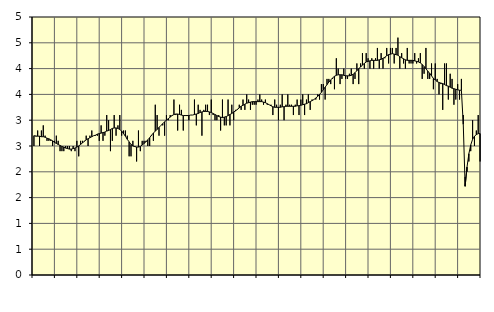
| Category | Piggar | Series 1 |
|---|---|---|
| nan | 2.5 | 2.7 |
| 1.0 | 2.7 | 2.69 |
| 1.0 | 2.8 | 2.69 |
| 1.0 | 2.5 | 2.69 |
| 1.0 | 2.8 | 2.68 |
| 1.0 | 2.9 | 2.68 |
| 1.0 | 2.7 | 2.67 |
| 1.0 | 2.6 | 2.65 |
| 1.0 | 2.6 | 2.64 |
| 1.0 | 2.6 | 2.62 |
| 1.0 | 2.5 | 2.6 |
| 1.0 | 2.6 | 2.57 |
| nan | 2.7 | 2.55 |
| 2.0 | 2.6 | 2.53 |
| 2.0 | 2.4 | 2.51 |
| 2.0 | 2.4 | 2.49 |
| 2.0 | 2.4 | 2.48 |
| 2.0 | 2.5 | 2.46 |
| 2.0 | 2.5 | 2.45 |
| 2.0 | 2.5 | 2.44 |
| 2.0 | 2.4 | 2.44 |
| 2.0 | 2.5 | 2.45 |
| 2.0 | 2.4 | 2.46 |
| 2.0 | 2.6 | 2.48 |
| nan | 2.3 | 2.5 |
| 3.0 | 2.6 | 2.53 |
| 3.0 | 2.6 | 2.56 |
| 3.0 | 2.6 | 2.59 |
| 3.0 | 2.7 | 2.62 |
| 3.0 | 2.5 | 2.64 |
| 3.0 | 2.7 | 2.66 |
| 3.0 | 2.8 | 2.68 |
| 3.0 | 2.7 | 2.7 |
| 3.0 | 2.7 | 2.71 |
| 3.0 | 2.7 | 2.73 |
| 3.0 | 2.6 | 2.74 |
| nan | 2.9 | 2.75 |
| 4.0 | 2.6 | 2.76 |
| 4.0 | 2.7 | 2.77 |
| 4.0 | 3.1 | 2.79 |
| 4.0 | 3 | 2.8 |
| 4.0 | 2.4 | 2.82 |
| 4.0 | 2.6 | 2.84 |
| 4.0 | 3.1 | 2.85 |
| 4.0 | 2.7 | 2.85 |
| 4.0 | 2.9 | 2.84 |
| 4.0 | 3.1 | 2.82 |
| 4.0 | 2.7 | 2.79 |
| nan | 2.8 | 2.74 |
| 5.0 | 2.8 | 2.69 |
| 5.0 | 2.7 | 2.63 |
| 5.0 | 2.3 | 2.58 |
| 5.0 | 2.3 | 2.53 |
| 5.0 | 2.6 | 2.5 |
| 5.0 | 2.5 | 2.49 |
| 5.0 | 2.2 | 2.48 |
| 5.0 | 2.8 | 2.48 |
| 5.0 | 2.4 | 2.49 |
| 5.0 | 2.6 | 2.52 |
| 5.0 | 2.6 | 2.55 |
| nan | 2.6 | 2.58 |
| 6.0 | 2.5 | 2.62 |
| 6.0 | 2.5 | 2.66 |
| 6.0 | 2.7 | 2.71 |
| 6.0 | 2.6 | 2.75 |
| 6.0 | 3.3 | 2.79 |
| 6.0 | 3.1 | 2.82 |
| 6.0 | 2.7 | 2.86 |
| 6.0 | 2.9 | 2.9 |
| 6.0 | 2.9 | 2.93 |
| 6.0 | 2.7 | 2.97 |
| 6.0 | 3.1 | 3 |
| nan | 3 | 3.03 |
| 7.0 | 3.1 | 3.06 |
| 7.0 | 3.1 | 3.09 |
| 7.0 | 3.4 | 3.11 |
| 7.0 | 3.1 | 3.12 |
| 7.0 | 2.8 | 3.12 |
| 7.0 | 3.3 | 3.11 |
| 7.0 | 3.2 | 3.1 |
| 7.0 | 2.8 | 3.09 |
| 7.0 | 3.1 | 3.09 |
| 7.0 | 3.1 | 3.09 |
| 7.0 | 3 | 3.09 |
| nan | 3.1 | 3.1 |
| 8.0 | 3.1 | 3.1 |
| 8.0 | 3.4 | 3.11 |
| 8.0 | 2.9 | 3.12 |
| 8.0 | 3.3 | 3.13 |
| 8.0 | 3.2 | 3.15 |
| 8.0 | 2.7 | 3.16 |
| 8.0 | 3.2 | 3.17 |
| 8.0 | 3.3 | 3.17 |
| 8.0 | 3.3 | 3.17 |
| 8.0 | 3.1 | 3.16 |
| 8.0 | 3.4 | 3.15 |
| nan | 3.1 | 3.13 |
| 9.0 | 3 | 3.11 |
| 9.0 | 3 | 3.09 |
| 9.0 | 3.1 | 3.07 |
| 9.0 | 2.8 | 3.06 |
| 9.0 | 3.4 | 3.05 |
| 9.0 | 2.9 | 3.06 |
| 9.0 | 2.9 | 3.07 |
| 9.0 | 3.4 | 3.09 |
| 9.0 | 2.9 | 3.11 |
| 9.0 | 3.3 | 3.13 |
| 9.0 | 3 | 3.16 |
| nan | 3.2 | 3.18 |
| 10.0 | 3.2 | 3.21 |
| 10.0 | 3.3 | 3.24 |
| 10.0 | 3.2 | 3.27 |
| 10.0 | 3.4 | 3.29 |
| 10.0 | 3.2 | 3.31 |
| 10.0 | 3.5 | 3.33 |
| 10.0 | 3.4 | 3.34 |
| 10.0 | 3.2 | 3.35 |
| 10.0 | 3.3 | 3.36 |
| 10.0 | 3.3 | 3.36 |
| 10.0 | 3.3 | 3.36 |
| nan | 3.4 | 3.36 |
| 11.0 | 3.5 | 3.36 |
| 11.0 | 3.4 | 3.36 |
| 11.0 | 3.3 | 3.35 |
| 11.0 | 3.4 | 3.34 |
| 11.0 | 3.3 | 3.32 |
| 11.0 | 3.3 | 3.3 |
| 11.0 | 3.3 | 3.28 |
| 11.0 | 3.1 | 3.26 |
| 11.0 | 3.4 | 3.25 |
| 11.0 | 3.3 | 3.25 |
| 11.0 | 3 | 3.25 |
| nan | 3.3 | 3.25 |
| 12.0 | 3.5 | 3.26 |
| 12.0 | 3 | 3.26 |
| 12.0 | 3.3 | 3.27 |
| 12.0 | 3.5 | 3.27 |
| 12.0 | 3.3 | 3.27 |
| 12.0 | 3.3 | 3.27 |
| 12.0 | 3.1 | 3.27 |
| 12.0 | 3.3 | 3.27 |
| 12.0 | 3.4 | 3.28 |
| 12.0 | 3.1 | 3.28 |
| 12.0 | 3.4 | 3.29 |
| nan | 3.5 | 3.3 |
| 13.0 | 3.1 | 3.31 |
| 13.0 | 3.4 | 3.32 |
| 13.0 | 3.5 | 3.34 |
| 13.0 | 3.2 | 3.36 |
| 13.0 | 3.4 | 3.38 |
| 13.0 | 3.4 | 3.4 |
| 13.0 | 3.4 | 3.43 |
| 13.0 | 3.5 | 3.46 |
| 13.0 | 3.4 | 3.5 |
| 13.0 | 3.7 | 3.54 |
| 13.0 | 3.7 | 3.59 |
| nan | 3.4 | 3.64 |
| 14.0 | 3.8 | 3.69 |
| 14.0 | 3.8 | 3.74 |
| 14.0 | 3.7 | 3.78 |
| 14.0 | 3.8 | 3.82 |
| 14.0 | 3.6 | 3.85 |
| 14.0 | 4.2 | 3.87 |
| 14.0 | 4 | 3.88 |
| 14.0 | 3.7 | 3.88 |
| 14.0 | 3.8 | 3.88 |
| 14.0 | 4 | 3.87 |
| 14.0 | 3.8 | 3.86 |
| nan | 3.8 | 3.86 |
| 15.0 | 3.9 | 3.86 |
| 15.0 | 4 | 3.87 |
| 15.0 | 3.7 | 3.89 |
| 15.0 | 3.8 | 3.92 |
| 15.0 | 4.1 | 3.96 |
| 15.0 | 3.7 | 4 |
| 15.0 | 4.1 | 4.03 |
| 15.0 | 4.3 | 4.07 |
| 15.0 | 4 | 4.1 |
| 15.0 | 4.3 | 4.13 |
| 15.0 | 4.2 | 4.14 |
| nan | 4 | 4.15 |
| 16.0 | 4.2 | 4.16 |
| 16.0 | 4 | 4.16 |
| 16.0 | 4.2 | 4.16 |
| 16.0 | 4.4 | 4.16 |
| 16.0 | 4 | 4.17 |
| 16.0 | 4.3 | 4.18 |
| 16.0 | 4 | 4.2 |
| 16.0 | 4.2 | 4.22 |
| 16.0 | 4.4 | 4.25 |
| 16.0 | 4.1 | 4.27 |
| 16.0 | 4.4 | 4.28 |
| nan | 4.4 | 4.29 |
| 17.0 | 4.1 | 4.28 |
| 17.0 | 4.4 | 4.27 |
| 17.0 | 4.6 | 4.26 |
| 17.0 | 4 | 4.23 |
| 17.0 | 4.3 | 4.21 |
| 17.0 | 4.1 | 4.19 |
| 17.0 | 4 | 4.17 |
| 17.0 | 4.4 | 4.16 |
| 17.0 | 4.1 | 4.16 |
| 17.0 | 4.1 | 4.16 |
| 17.0 | 4.1 | 4.16 |
| nan | 4.3 | 4.15 |
| 18.0 | 4.1 | 4.14 |
| 18.0 | 4.2 | 4.13 |
| 18.0 | 4.3 | 4.11 |
| 18.0 | 3.8 | 4.08 |
| 18.0 | 3.9 | 4.04 |
| 18.0 | 4.4 | 4 |
| 18.0 | 3.8 | 3.95 |
| 18.0 | 3.8 | 3.91 |
| 18.0 | 4.1 | 3.86 |
| 18.0 | 3.6 | 3.81 |
| 18.0 | 4.1 | 3.78 |
| nan | 3.8 | 3.75 |
| 19.0 | 3.5 | 3.73 |
| 19.0 | 3.7 | 3.72 |
| 19.0 | 3.2 | 3.71 |
| 19.0 | 4.1 | 3.69 |
| 19.0 | 4.1 | 3.67 |
| 19.0 | 3.4 | 3.66 |
| 19.0 | 3.9 | 3.64 |
| 19.0 | 3.8 | 3.62 |
| 19.0 | 3.3 | 3.61 |
| 19.0 | 3.4 | 3.6 |
| 19.0 | 3.7 | 3.59 |
| nan | 3.4 | 3.58 |
| 20.0 | 3.8 | 3.58 |
| 20.0 | 3.1 | 2.92 |
| 20.0 | 1.9 | 1.72 |
| 20.0 | 2 | 2.09 |
| 20.0 | 2.2 | 2.35 |
| 20.0 | 2.4 | 2.52 |
| 20.0 | 3 | 2.63 |
| 20.0 | 2.5 | 2.69 |
| 20.0 | 2.8 | 2.72 |
| 20.0 | 3.1 | 2.74 |
| 20.0 | 2.2 | 2.74 |